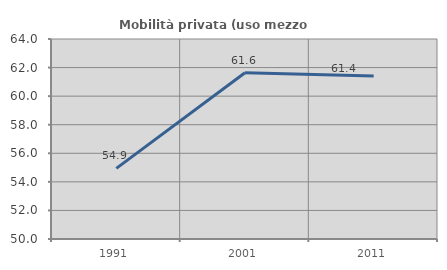
| Category | Mobilità privata (uso mezzo privato) |
|---|---|
| 1991.0 | 54.946 |
| 2001.0 | 61.636 |
| 2011.0 | 61.418 |